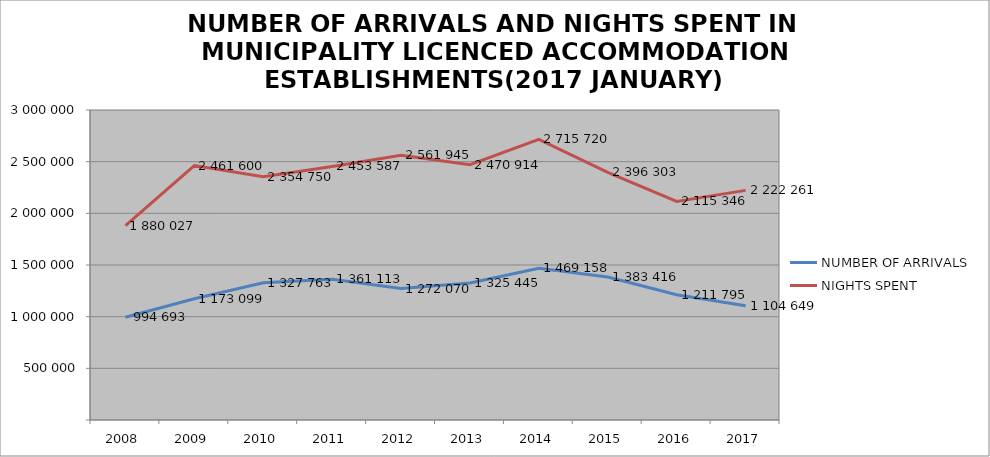
| Category | NUMBER OF ARRIVALS | NIGHTS SPENT |
|---|---|---|
| 2008 | 994693 | 1880027 |
| 2009 | 1173099 | 2461600 |
| 2010 | 1327763 | 2354750 |
| 2011 | 1361113 | 2453587 |
| 2012 | 1272070 | 2561945 |
| 2013 | 1325445 | 2470914 |
| 2014 | 1469158 | 2715720 |
| 2015 | 1383416 | 2396303 |
| 2016 | 1211795 | 2115346 |
| 2017 | 1104649 | 2222261 |